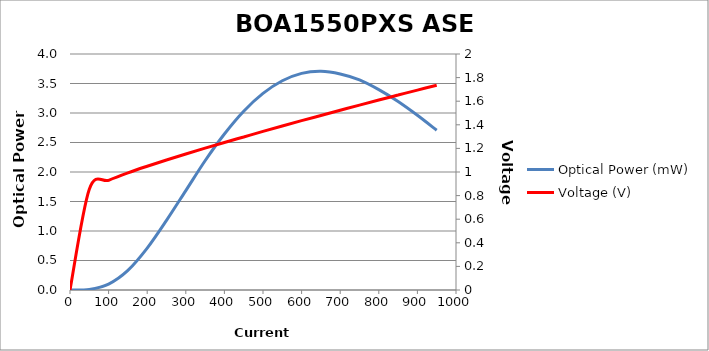
| Category | Optical Power (mW) |
|---|---|
| 0.0 | 0 |
| 50.0 | 0.011 |
| 100.0 | 0.1 |
| 150.0 | 0.332 |
| 200.0 | 0.71 |
| 250.0 | 1.18 |
| 300.0 | 1.685 |
| 350.0 | 2.191 |
| 400.0 | 2.644 |
| 450.0 | 3.03 |
| 500.0 | 3.332 |
| 550.0 | 3.546 |
| 600.0 | 3.672 |
| 650.0 | 3.707 |
| 700.0 | 3.662 |
| 750.0 | 3.561 |
| 800.0 | 3.396 |
| 850.0 | 3.195 |
| 900.0 | 2.961 |
| 950.0 | 2.707 |